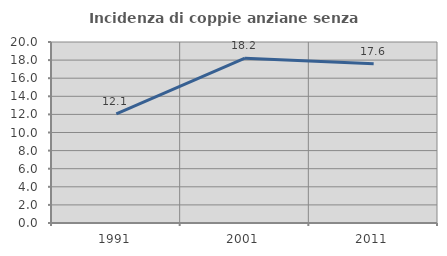
| Category | Incidenza di coppie anziane senza figli  |
|---|---|
| 1991.0 | 12.069 |
| 2001.0 | 18.216 |
| 2011.0 | 17.589 |